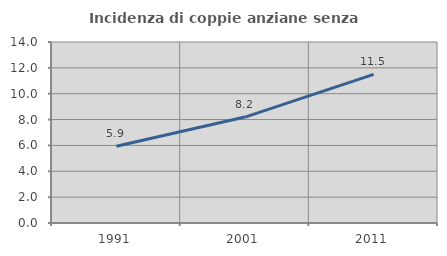
| Category | Incidenza di coppie anziane senza figli  |
|---|---|
| 1991.0 | 5.934 |
| 2001.0 | 8.194 |
| 2011.0 | 11.498 |